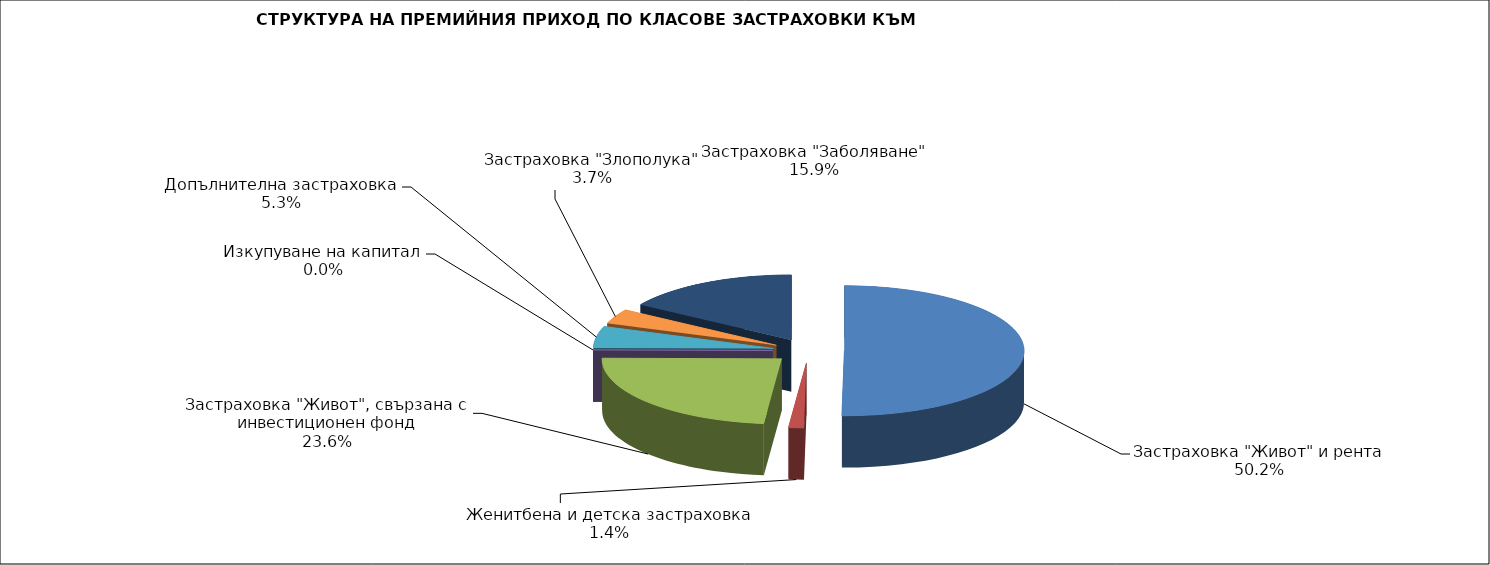
| Category | Series 0 |
|---|---|
| Застраховка "Живот" и рента | 46440122.291 |
| Женитбена и детска застраховка | 1267585.388 |
| Застраховка "Живот", свързана с инвестиционен фонд | 21793209.482 |
| Изкупуване на капитал | 0 |
| Допълнителна застраховка | 4931558.449 |
| Застраховка "Злополука" | 3376839.59 |
| Застраховка "Заболяване" | 14666156.37 |